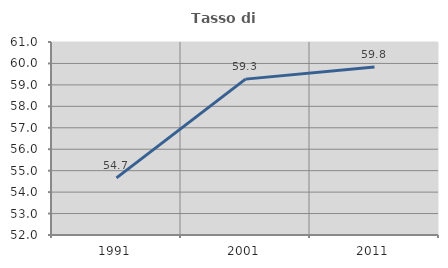
| Category | Tasso di occupazione   |
|---|---|
| 1991.0 | 54.663 |
| 2001.0 | 59.269 |
| 2011.0 | 59.83 |